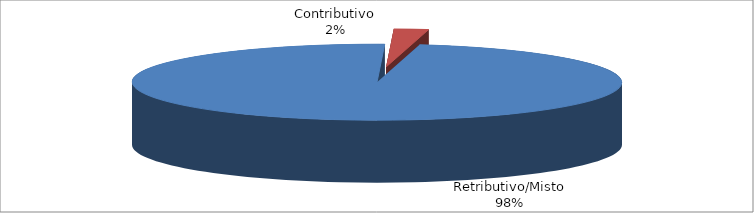
| Category | Series 1 |
|---|---|
| Retributivo/Misto | 11715 |
| Contributivo | 273 |